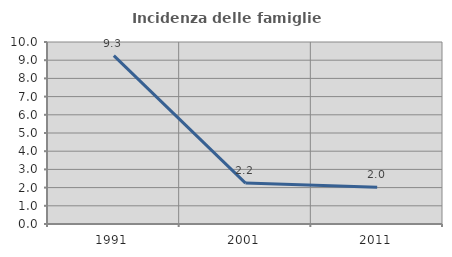
| Category | Incidenza delle famiglie numerose |
|---|---|
| 1991.0 | 9.254 |
| 2001.0 | 2.247 |
| 2011.0 | 2.017 |